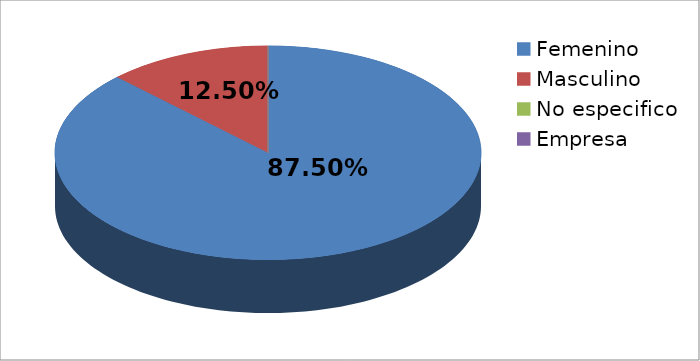
| Category | Series 0 |
|---|---|
| Femenino | 7 |
| Masculino | 1 |
| No especifico | 0 |
| Empresa | 0 |